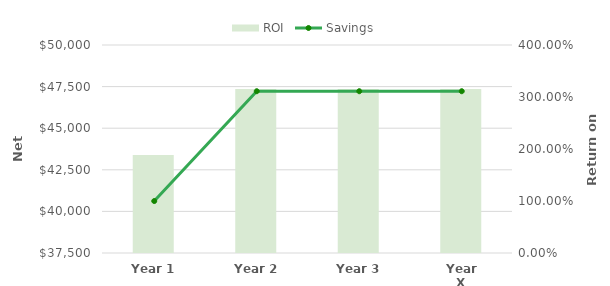
| Category | ROI |
|---|---|
| 0 | 1.883 |
| 1 | 3.154 |
| 2 | 3.154 |
| 3 | 3.154 |